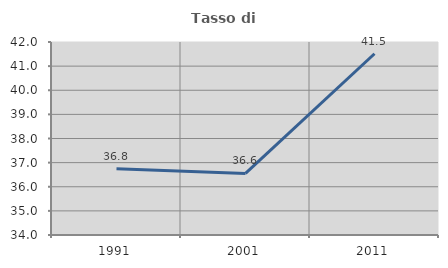
| Category | Tasso di occupazione   |
|---|---|
| 1991.0 | 36.75 |
| 2001.0 | 36.551 |
| 2011.0 | 41.512 |